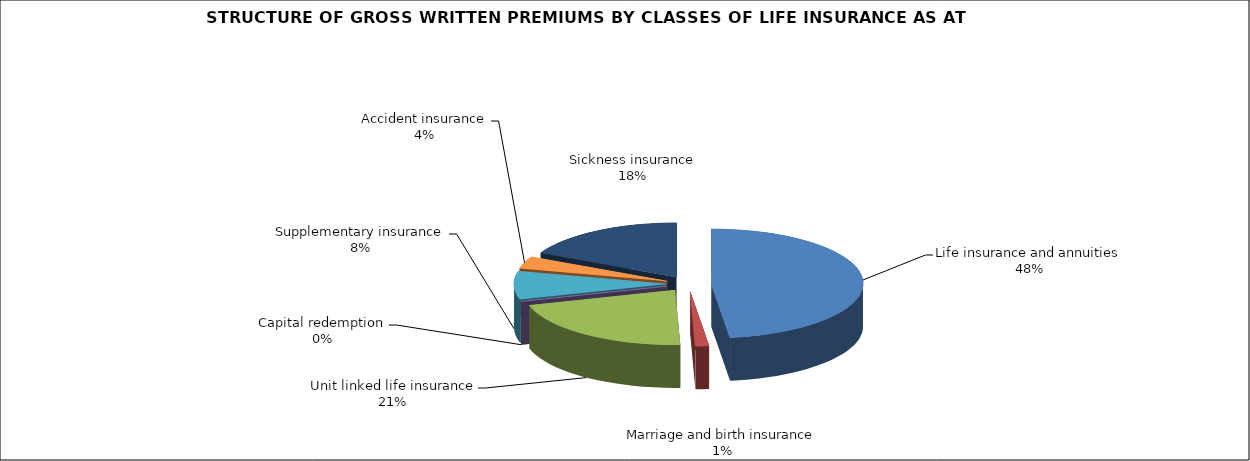
| Category | Life insurance and annuities |
|---|---|
| Life insurance and annuities | 0.48 |
| Marriage and birth insurance | 0.014 |
| Unit linked life insurance | 0.21 |
| Capital redemption | 0 |
| Supplementary insurance | 0.083 |
| Accident insurance | 0.036 |
| Sickness insurance | 0.176 |